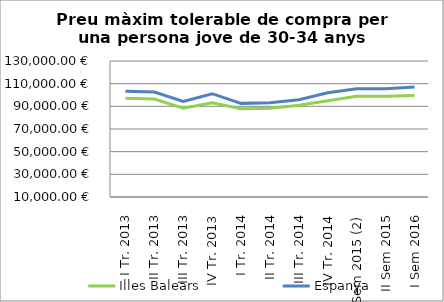
| Category | Illes Balears | Espanya |
|---|---|---|
| I Tr. 2013 | 97108.2 | 103408.52 |
| II Tr. 2013 | 96372.02 | 102624.58 |
| III Tr. 2013 | 88369.48 | 94389.78 |
| IV Tr. 2013 | 93173.63 | 101149.07 |
| I Tr. 2014 | 87906.57 | 92612.34 |
| II Tr. 2014 | 88279.68 | 93084.13 |
| III Tr. 2014 | 91009.68 | 95798.99 |
| IV Tr. 2014 | 94874.66 | 101919.32 |
| I Sem 2015 (2) | 98931.87 | 105467.42 |
| II Sem 2015 | 98884.82 | 105520.76 |
| I Sem 2016 | 99514.55 | 107118.08 |